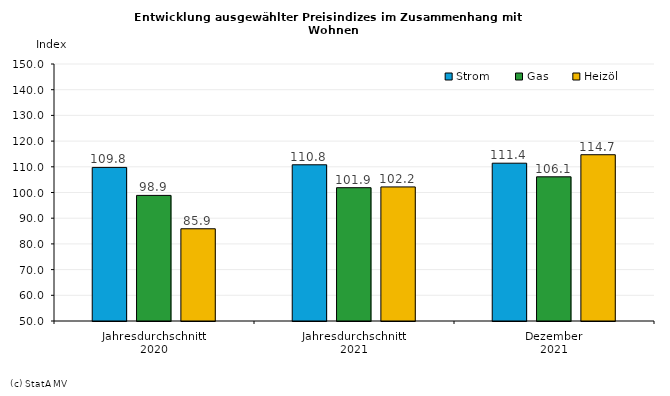
| Category | Strom | Gas | Heizöl |
|---|---|---|---|
| Jahresdurchschnitt
2020 | 109.758 | 98.875 | 85.883 |
| Jahresdurchschnitt
2021 | 110.783 | 101.867 | 102.167 |
| Dezember
2021 | 111.4 | 106.1 | 114.7 |